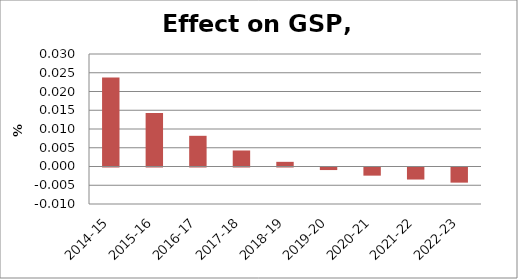
| Category | Series 0 |
|---|---|
| 2014-15 | 0.024 |
| 2015-16 | 0.014 |
| 2016-17 | 0.008 |
| 2017-18 | 0.004 |
| 2018-19 | 0.001 |
| 2019-20 | -0.001 |
| 2020-21 | -0.002 |
| 2021-22 | -0.003 |
| 2022-23 | -0.004 |